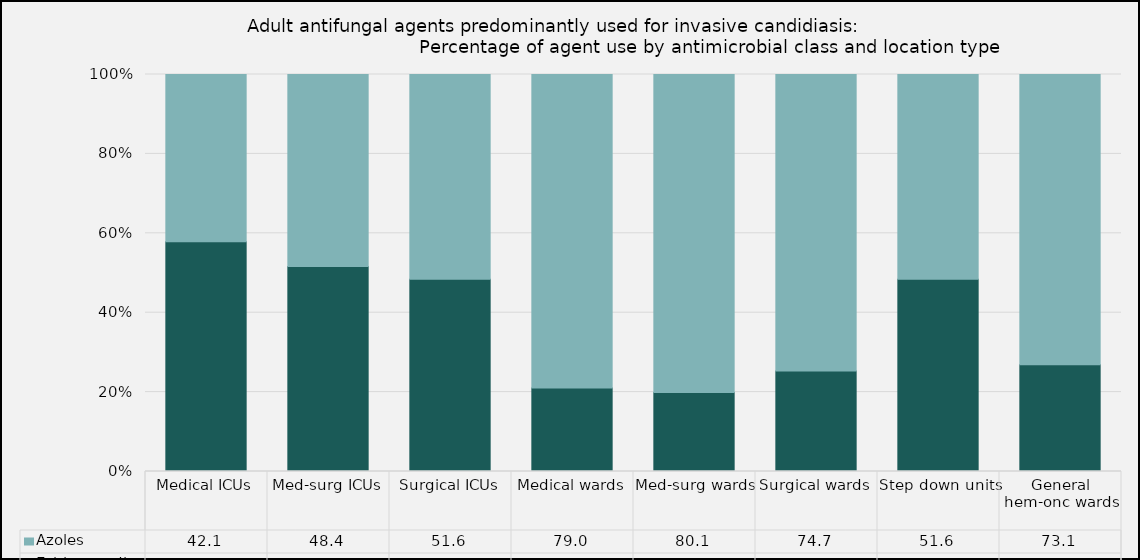
| Category | Echinocandins | Azoles |
|---|---|---|
| Medical ICUs | 57.9 | 42.1 |
| Med-surg ICUs | 51.61 | 48.39 |
| Surgical ICUs | 48.4 | 51.6 |
| Medical wards | 21.05 | 78.95 |
| Med-surg wards | 19.93 | 80.07 |
| Surgical wards | 25.31 | 74.69 |
| Step down units | 48.4 | 51.6 |
| General hem-onc wards | 26.91 | 73.09 |